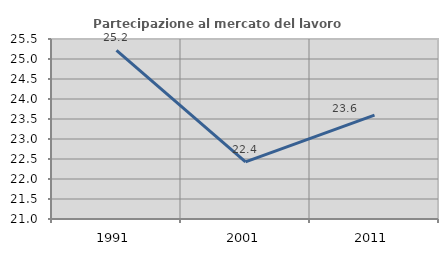
| Category | Partecipazione al mercato del lavoro  femminile |
|---|---|
| 1991.0 | 25.217 |
| 2001.0 | 22.43 |
| 2011.0 | 23.596 |